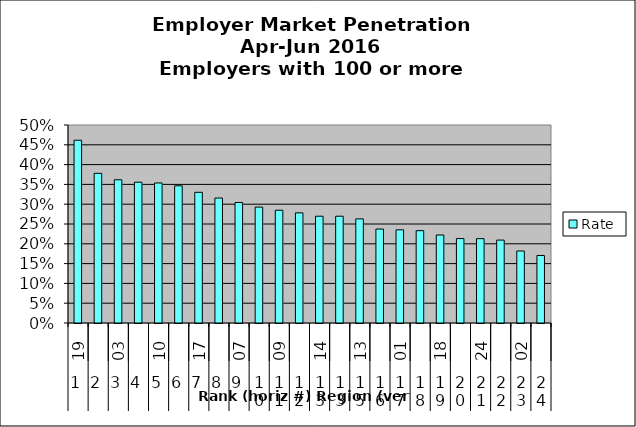
| Category | Rate |
|---|---|
| 0 | 0.462 |
| 1 | 0.378 |
| 2 | 0.362 |
| 3 | 0.356 |
| 4 | 0.354 |
| 5 | 0.346 |
| 6 | 0.33 |
| 7 | 0.316 |
| 8 | 0.304 |
| 9 | 0.293 |
| 10 | 0.285 |
| 11 | 0.278 |
| 12 | 0.27 |
| 13 | 0.27 |
| 14 | 0.263 |
| 15 | 0.237 |
| 16 | 0.235 |
| 17 | 0.233 |
| 18 | 0.222 |
| 19 | 0.213 |
| 20 | 0.213 |
| 21 | 0.209 |
| 22 | 0.182 |
| 23 | 0.171 |